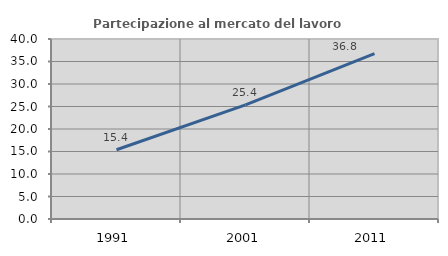
| Category | Partecipazione al mercato del lavoro  femminile |
|---|---|
| 1991.0 | 15.385 |
| 2001.0 | 25.373 |
| 2011.0 | 36.765 |